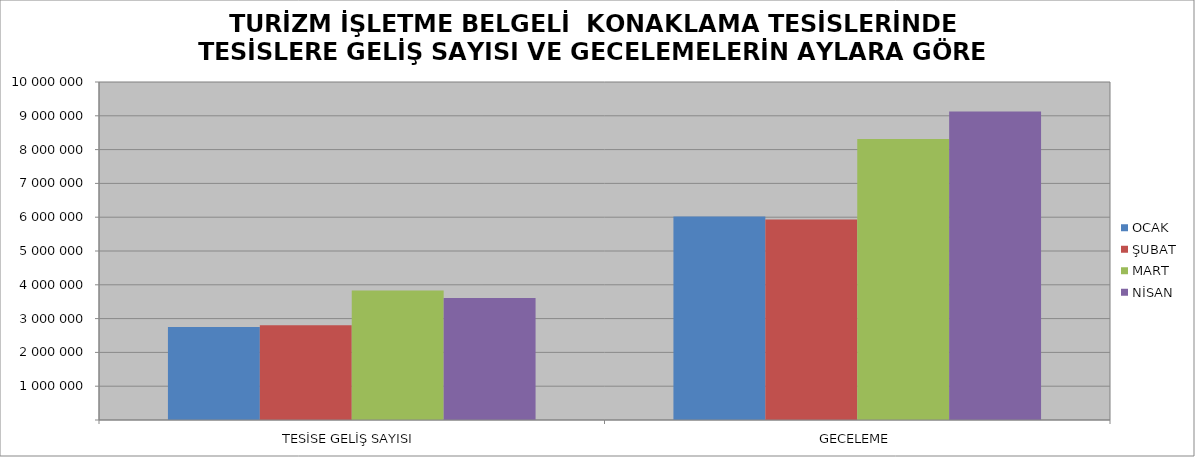
| Category | OCAK | ŞUBAT | MART | NİSAN |
|---|---|---|---|---|
| TESİSE GELİŞ SAYISI | 2752012 | 2800059 | 3828458 | 3612924 |
| GECELEME | 6020345 | 5929648 | 8312048 | 9130051 |